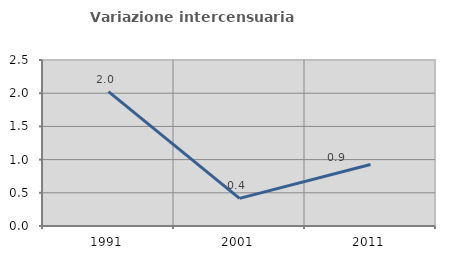
| Category | Variazione intercensuaria annua |
|---|---|
| 1991.0 | 2.024 |
| 2001.0 | 0.416 |
| 2011.0 | 0.927 |